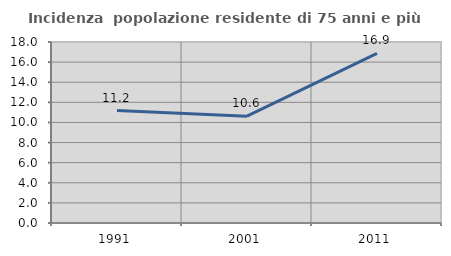
| Category | Incidenza  popolazione residente di 75 anni e più |
|---|---|
| 1991.0 | 11.18 |
| 2001.0 | 10.625 |
| 2011.0 | 16.875 |